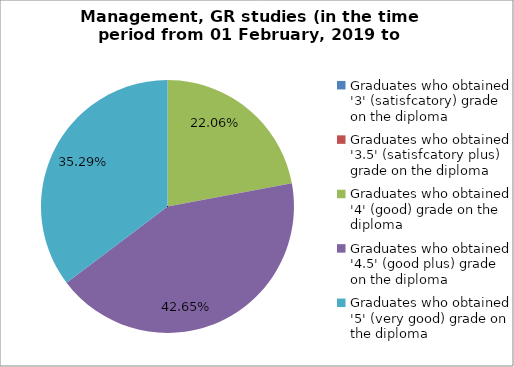
| Category | Series 0 |
|---|---|
| Graduates who obtained '3' (satisfcatory) grade on the diploma | 0 |
| Graduates who obtained '3.5' (satisfcatory plus) grade on the diploma | 0 |
| Graduates who obtained '4' (good) grade on the diploma | 22.059 |
| Graduates who obtained '4.5' (good plus) grade on the diploma | 42.647 |
| Graduates who obtained '5' (very good) grade on the diploma | 35.294 |